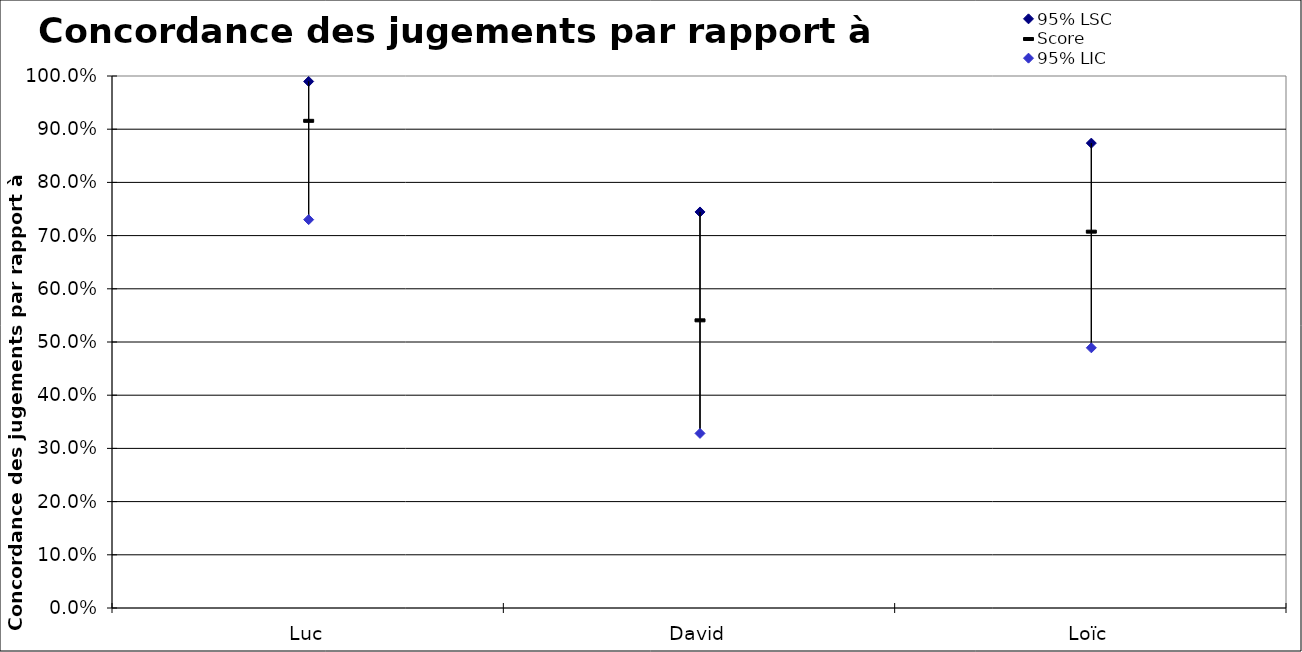
| Category | 95% LSC | Score | 95% LIC |
|---|---|---|---|
| Luc | 0.99 | 0.917 | 0.73 |
| David | 0.744 | 0.542 | 0.328 |
| Loïc | 0.874 | 0.708 | 0.489 |